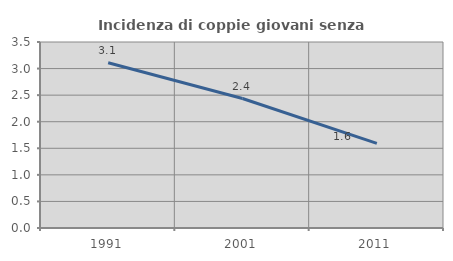
| Category | Incidenza di coppie giovani senza figli |
|---|---|
| 1991.0 | 3.11 |
| 2001.0 | 2.436 |
| 2011.0 | 1.593 |